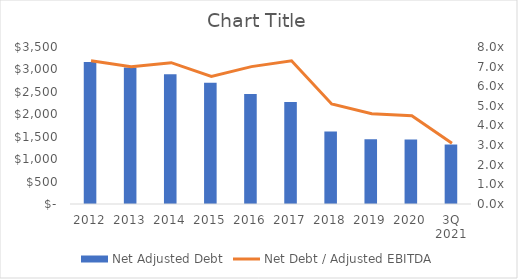
| Category | Net Adjusted Debt |
|---|---|
| 2012 | 3165 |
| 2013 | 3042 |
| 2014 | 2892 |
| 2015 | 2703 |
| 2016 | 2454 |
| 2017 | 2274 |
| 2018 | 1615 |
| 2019 | 1443 |
| 2020 | 1440 |
| 3Q 2021 | 1326 |